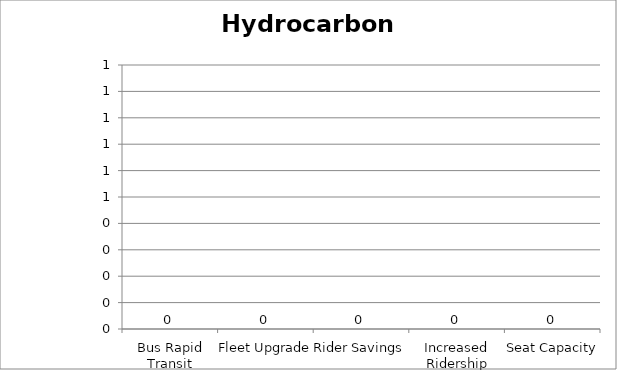
| Category | Hydrocarbons |
|---|---|
| Bus Rapid Transit | 0 |
| Fleet Upgrade | 0 |
| Rider Savings | 0 |
| Increased Ridership | 0 |
| Seat Capacity | 0 |